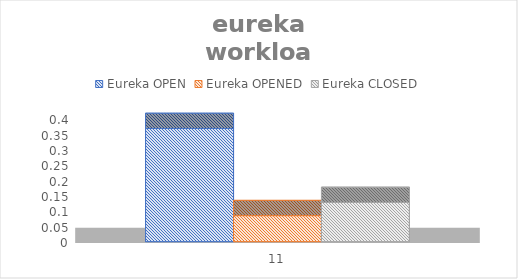
| Category | Eureka |
|---|---|
| 0 | 0.128 |